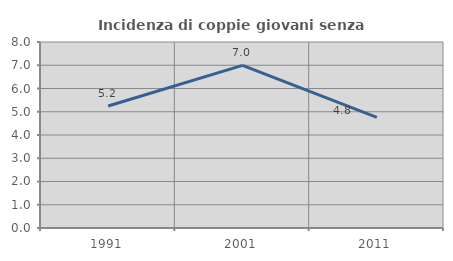
| Category | Incidenza di coppie giovani senza figli |
|---|---|
| 1991.0 | 5.246 |
| 2001.0 | 6.996 |
| 2011.0 | 4.756 |